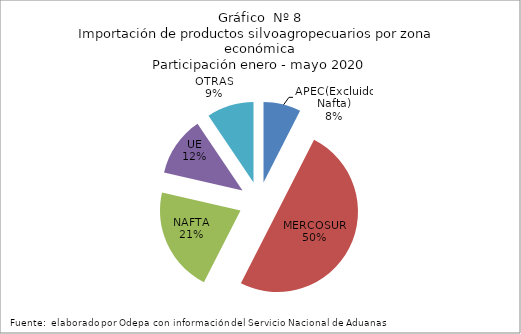
| Category | Series 0 |
|---|---|
| APEC(Excluido Nafta) | 190429.916 |
| MERCOSUR | 1268958.979 |
| NAFTA | 534997.676 |
| UE | 303686.524 |
| OTRAS | 239446.905 |